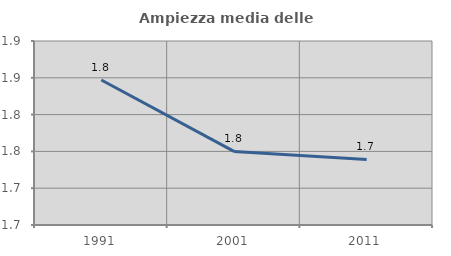
| Category | Ampiezza media delle famiglie |
|---|---|
| 1991.0 | 1.847 |
| 2001.0 | 1.75 |
| 2011.0 | 1.739 |